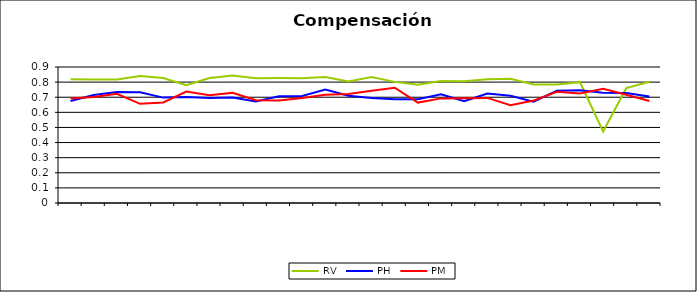
| Category | RV | PH | PM |
|---|---|---|---|
| 0 | 0.819 | 0.675 | 0.691 |
| 1 | 0.818 | 0.714 | 0.701 |
| 2 | 0.817 | 0.734 | 0.722 |
| 3 | 0.84 | 0.732 | 0.656 |
| 4 | 0.827 | 0.697 | 0.666 |
| 5 | 0.78 | 0.701 | 0.737 |
| 6 | 0.827 | 0.695 | 0.713 |
| 7 | 0.844 | 0.699 | 0.73 |
| 8 | 0.826 | 0.672 | 0.68 |
| 9 | 0.827 | 0.706 | 0.678 |
| 10 | 0.826 | 0.709 | 0.696 |
| 11 | 0.834 | 0.751 | 0.717 |
| 12 | 0.804 | 0.709 | 0.721 |
| 13 | 0.834 | 0.694 | 0.743 |
| 14 | 0.802 | 0.687 | 0.763 |
| 15 | 0.783 | 0.687 | 0.665 |
| 16 | 0.807 | 0.72 | 0.692 |
| 17 | 0.805 | 0.674 | 0.693 |
| 18 | 0.82 | 0.724 | 0.695 |
| 19 | 0.822 | 0.71 | 0.646 |
| 20 | 0.784 | 0.67 | 0.678 |
| 21 | 0.785 | 0.743 | 0.736 |
| 22 | 0.8 | 0.745 | 0.725 |
| 23 | 0.473 | 0.729 | 0.756 |
| 24 | 0.76 | 0.727 | 0.716 |
| 25 | 0.802 | 0.705 | 0.675 |